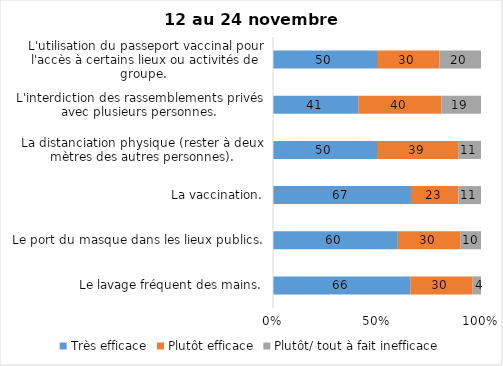
| Category | Très efficace | Plutôt efficace | Plutôt/ tout à fait inefficace |
|---|---|---|---|
| Le lavage fréquent des mains. | 66 | 30 | 4 |
| Le port du masque dans les lieux publics. | 60 | 30 | 10 |
| La vaccination. | 67 | 23 | 11 |
| La distanciation physique (rester à deux mètres des autres personnes). | 50 | 39 | 11 |
| L'interdiction des rassemblements privés avec plusieurs personnes. | 41 | 40 | 19 |
| L'utilisation du passeport vaccinal pour l'accès à certains lieux ou activités de groupe.  | 50 | 30 | 20 |